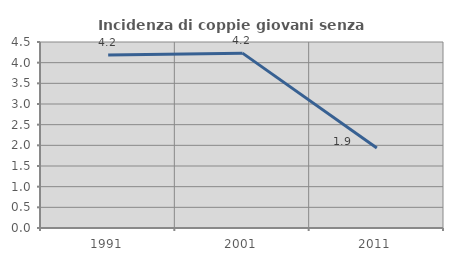
| Category | Incidenza di coppie giovani senza figli |
|---|---|
| 1991.0 | 4.188 |
| 2001.0 | 4.231 |
| 2011.0 | 1.933 |